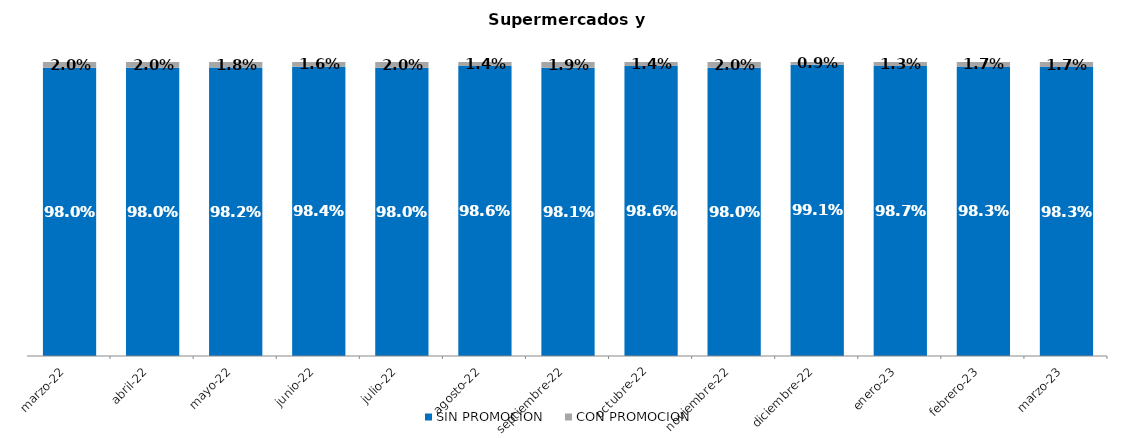
| Category | SIN PROMOCION   | CON PROMOCION   |
|---|---|---|
| 2022-03-01 | 0.98 | 0.02 |
| 2022-04-01 | 0.98 | 0.02 |
| 2022-05-01 | 0.982 | 0.018 |
| 2022-06-01 | 0.984 | 0.016 |
| 2022-07-01 | 0.98 | 0.02 |
| 2022-08-01 | 0.986 | 0.014 |
| 2022-09-01 | 0.981 | 0.019 |
| 2022-10-01 | 0.986 | 0.014 |
| 2022-11-01 | 0.98 | 0.02 |
| 2022-12-01 | 0.991 | 0.009 |
| 2023-01-01 | 0.987 | 0.013 |
| 2023-02-01 | 0.983 | 0.017 |
| 2023-03-01 | 0.983 | 0.017 |